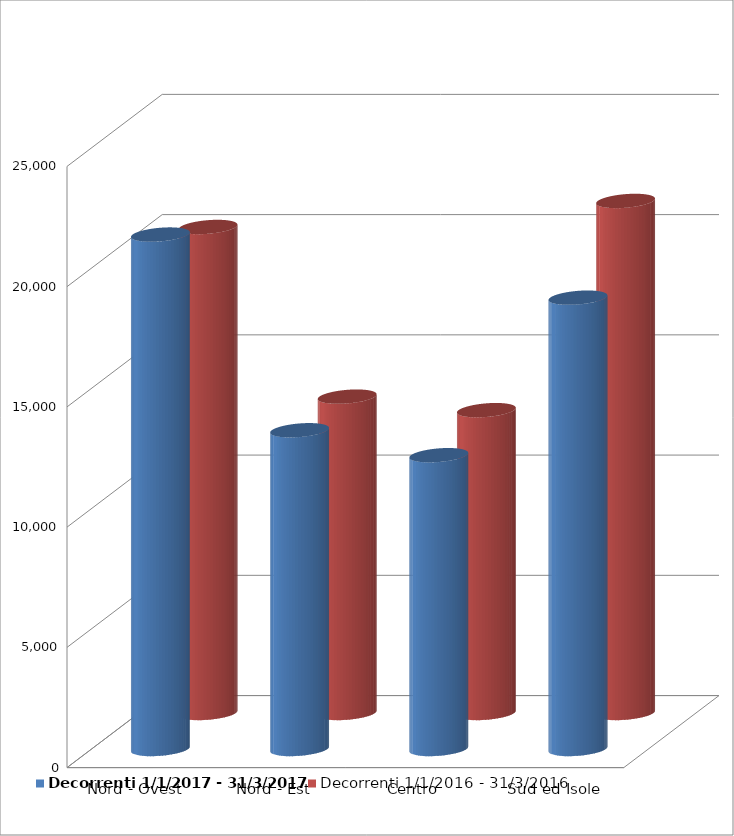
| Category | Decorrenti 1/1/2017 - 31/3/2017 | Decorrenti 1/1/2016 - 31/3/2016 |
|---|---|---|
| Nord - Ovest | 21393 | 20210 |
| Nord - Est | 13255 | 13155 |
| Centro | 12218 | 12593 |
| Sud ed Isole | 18769 | 21293 |